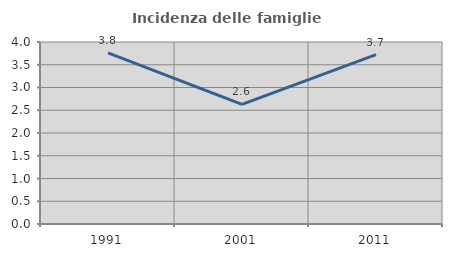
| Category | Incidenza delle famiglie numerose |
|---|---|
| 1991.0 | 3.759 |
| 2001.0 | 2.629 |
| 2011.0 | 3.724 |